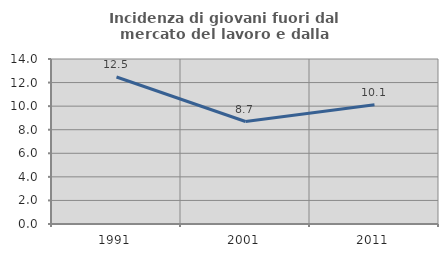
| Category | Incidenza di giovani fuori dal mercato del lavoro e dalla formazione  |
|---|---|
| 1991.0 | 12.47 |
| 2001.0 | 8.696 |
| 2011.0 | 10.123 |